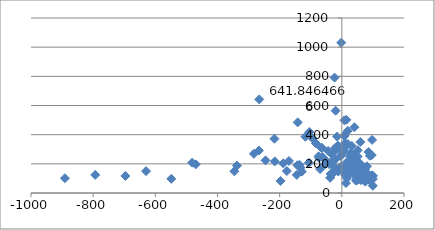
| Category | Series 0 |
|---|---|
| -1.7579744596163416 | 1031.116 |
| -23.357709214904894 | 791.336 |
| -265.672550213025 | 641.846 |
| -20.05464480874317 | 564.329 |
| 14.605370219690805 | 501.858 |
| 8.21015855952701 | 498.134 |
| -142.0102080879466 | 484.565 |
| 40.586273681757945 | 451.04 |
| 19.24805884756845 | 426.146 |
| -104.62068550449881 | 418.404 |
| 7.528175949228581 | 396.039 |
| 8.520061390046042 | 390.813 |
| -15.030774214447684 | 387.253 |
| -117.19674174891969 | 385.74 |
| -93.94802826532938 | 373.081 |
| -216.85607205464547 | 372.044 |
| 97.36290080910997 | 364.113 |
| 59.43589743589743 | 349.495 |
| 10.749424324890098 | 342.531 |
| -83.09174144038658 | 340.01 |
| 19.557497951379403 | 335.249 |
| -12.707957506514331 | 324.888 |
| 31.930119974742162 | 323.201 |
| -21.031515887582646 | 309.971 |
| -64.49788007562317 | 309.347 |
| -64.49788007562317 | 309.347 |
| 6.3192249756328085 | 303.744 |
| -18.800479391381376 | 297.205 |
| 51.01270168211466 | 292.909 |
| -266.7356279020263 | 291.173 |
| -44.080325429043555 | 288.422 |
| 7.249691425252306 | 283.281 |
| 85.7061361286412 | 281.209 |
| 27.76377385667987 | 274.763 |
| -282.90587247238193 | 268.659 |
| 0.6124327256547637 | 268.21 |
| -32.52370623980497 | 266.89 |
| 96.15331203999445 | 260.236 |
| 38.53624696496705 | 257.08 |
| 40.78871617731721 | 255.854 |
| 89.85068603712672 | 255.415 |
| -3.510721539639729 | 252.561 |
| 26.49098474341193 | 251.93 |
| -74.69164841701138 | 251.697 |
| 50.70930749839355 | 249.889 |
| -62.09200120530562 | 246.198 |
| -73.67175984935508 | 240.974 |
| -24.033810275472277 | 237.176 |
| -20.945966670377828 | 230.363 |
| -21.918014733304375 | 228.811 |
| -53.39181568777403 | 226.444 |
| -245.40049577813926 | 223.49 |
| 38.308237378210805 | 221.785 |
| -170.07531234411462 | 219.606 |
| 23.571231280998187 | 218.093 |
| -215.7399442658432 | 216.462 |
| -29.983881855377536 | 214.351 |
| 21.959879282797797 | 212.337 |
| 16.4908893240152 | 211.965 |
| 42.903712821301845 | 211.715 |
| 29.411764705882355 | 208.785 |
| -481.6111111111111 | 207.803 |
| 29.710920770877948 | 207.112 |
| -105.8754324569537 | 207.078 |
| 56.27005237612087 | 206.753 |
| -188.37555886736214 | 203.381 |
| -53.59837441470094 | 196.808 |
| -470.00504965494025 | 196.345 |
| 24.203539004862897 | 196.234 |
| -39.47079791609542 | 195.868 |
| 23.98389000264257 | 194.959 |
| 26.285651841328818 | 193.661 |
| -136.0 | 193.202 |
| -143.06546848348788 | 190.179 |
| -337.39714525608736 | 187.677 |
| 55.342465753424655 | 185.592 |
| -1.9211956732379991 | 184.542 |
| 80.88183008771496 | 183.265 |
| 20.34782362087157 | 181.428 |
| 28.8365694534309 | 177.369 |
| -22.341849329328138 | 176.393 |
| 50.363756613756614 | 176.243 |
| 70.9915611814346 | 175.934 |
| -133.10281458554988 | 173.944 |
| 67.90308106491175 | 172.76 |
| 66.52098391886592 | 170.83 |
| 29.186799629896164 | 167.972 |
| -69.9428843407901 | 163.991 |
| 25.192820586751242 | 162.731 |
| 58.92972972972973 | 161.097 |
| 74.80796885412647 | 160.059 |
| 5.9789339256796925 | 160.022 |
| 33.39415334576177 | 159.732 |
| 16.498718025162482 | 154.639 |
| 17.742366859780507 | 153.198 |
| -176.95844060316293 | 150.736 |
| 32.07609473212327 | 150.722 |
| -629.8156848572461 | 149.948 |
| 30.76640837744572 | 149.071 |
| -345.7043648102433 | 148.826 |
| 61.74423825202035 | 148.78 |
| -12.107027988777116 | 147.948 |
| -128.8130892956184 | 146.669 |
| 35.671173346209564 | 143.216 |
| 72.53978564468983 | 141.88 |
| 43.981990995497746 | 141.637 |
| 17.461857991381653 | 138.635 |
| 52.72206303724928 | 137.975 |
| 52.787130564908345 | 136.55 |
| -31.221376773746627 | 135.464 |
| 8.478663247805192 | 134.951 |
| 48.6383182035356 | 134.811 |
| -29.239021601213352 | 133.367 |
| 23.591509891448965 | 131.034 |
| -36.247842745655646 | 130.896 |
| 42.03521703521704 | 130.017 |
| 79.04884318766067 | 127.247 |
| 82.38312506450589 | 126.945 |
| 61.41327623126338 | 126.12 |
| 51.07047461801658 | 124.963 |
| 56.52500536595836 | 124.925 |
| -144.9385853451927 | 124.21 |
| -793.3396048918156 | 124.204 |
| 62.607378408875505 | 122.374 |
| 87.89327505349907 | 122.329 |
| 10.591829806495417 | 121.691 |
| 58.63272323301847 | 121.154 |
| 97.00451374640951 | 121.134 |
| 95.44599958220181 | 119.945 |
| 98.0801137710358 | 118.107 |
| 100.0 | 117.223 |
| -696.4146096280576 | 116.877 |
| 45.325290822921154 | 115.772 |
| 72.72836358182091 | 114.411 |
| 67.13988606564789 | 112.696 |
| 78.93087877735326 | 112.471 |
| 81.58787153401157 | 111.387 |
| 80.49923973644196 | 111.216 |
| 62.24673710379117 | 107.708 |
| 47.34745229607884 | 104.38 |
| 85.1927729102002 | 104.313 |
| -37.60496717390198 | 103.884 |
| 51.357570179475374 | 101.848 |
| 16.60041266776459 | 101.621 |
| -890.9162717219589 | 101.365 |
| -548.7012987012987 | 96.997 |
| 99.88465974625143 | 96.111 |
| 94.79088404708239 | 94.975 |
| 50.91375690178085 | 90.007 |
| 61.69876855067887 | 88.254 |
| 45.25222551928783 | 84.773 |
| 90.65073041168658 | 84.028 |
| -197.157394843962 | 82.648 |
| 75.38951841359773 | 78.099 |
| 13.246679451665603 | 68.193 |
| 99.65078210258275 | 49.667 |